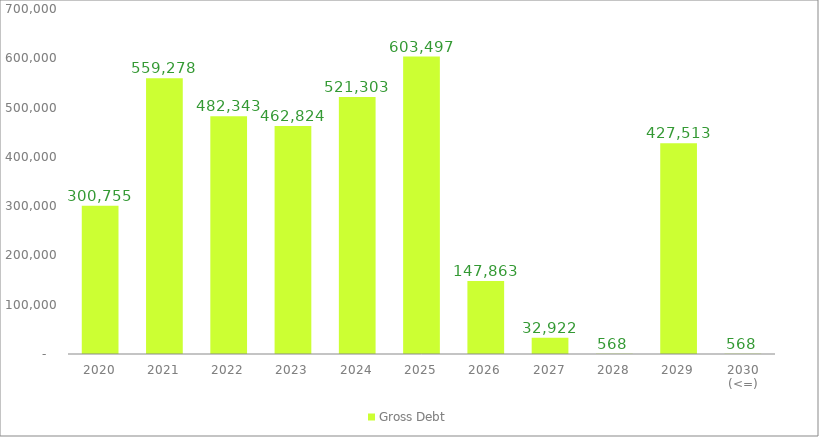
| Category | Gross Debt |
|---|---|
| 2020 | 300755.243 |
| 2021 | 559278.333 |
| 2022 | 482343.278 |
| 2023 | 462823.749 |
| 2024 | 521302.917 |
| 2025 | 603497.4 |
| 2026 | 147862.771 |
| 2027 | 32922.49 |
| 2028 | 567.533 |
| 2029 | 427512.903 |
| 2030 (<=) | 567.533 |